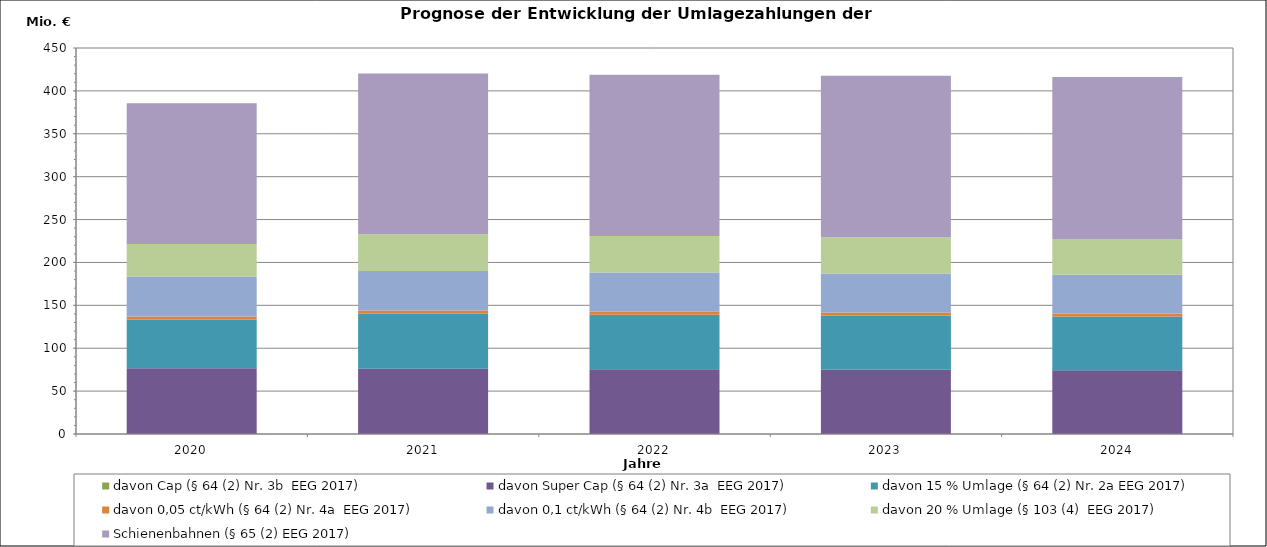
| Category | davon Cap (§ 64 (2) Nr. 3b  EEG 2017) | davon Super Cap (§ 64 (2) Nr. 3a  EEG 2017) | davon 15 % Umlage (§ 64 (2) Nr. 2a EEG 2017) | davon 0,05 ct/kWh (§ 64 (2) Nr. 4a  EEG 2017) | davon 0,1 ct/kWh (§ 64 (2) Nr. 4b  EEG 2017) | davon 20 % Umlage (§ 103 (4)  EEG 2017) | Schienenbahnen (§ 65 (2) EEG 2017) |
|---|---|---|---|---|---|---|---|
| 2020.0 | 0 | 76.689 | 56.786 | 3.594 | 46.416 | 37.892 | 164.152 |
| 2021.0 | 0 | 76.101 | 64.184 | 3.568 | 46.067 | 42.85 | 187.492 |
| 2022.0 | 0 | 75.455 | 63.659 | 3.537 | 45.673 | 42.49 | 187.895 |
| 2023.0 | 0 | 74.986 | 63.244 | 3.515 | 45.393 | 42.223 | 188.299 |
| 2024.0 | 0 | 74.349 | 62.726 | 3.485 | 45.004 | 41.867 | 188.705 |